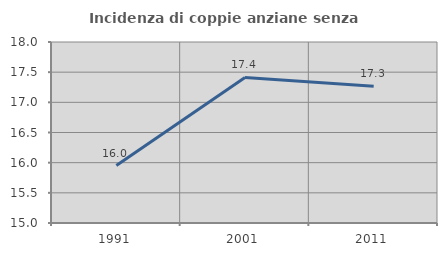
| Category | Incidenza di coppie anziane senza figli  |
|---|---|
| 1991.0 | 15.952 |
| 2001.0 | 17.412 |
| 2011.0 | 17.265 |